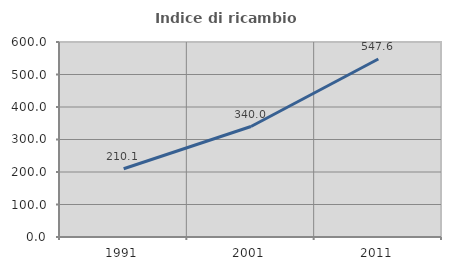
| Category | Indice di ricambio occupazionale  |
|---|---|
| 1991.0 | 210.135 |
| 2001.0 | 340 |
| 2011.0 | 547.573 |